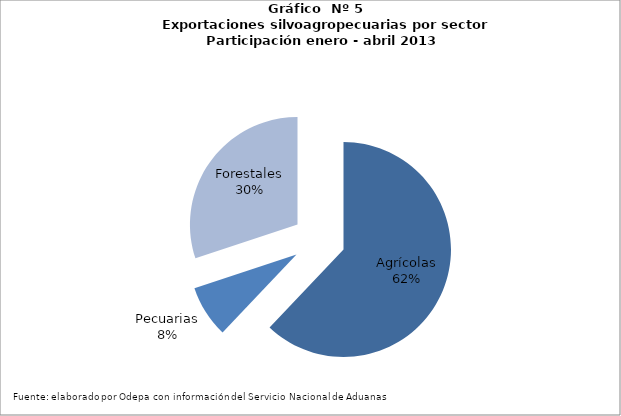
| Category | Series 0 |
|---|---|
| Agrícolas | 3437571 |
| Pecuarias | 434140 |
| Forestales | 1666193 |